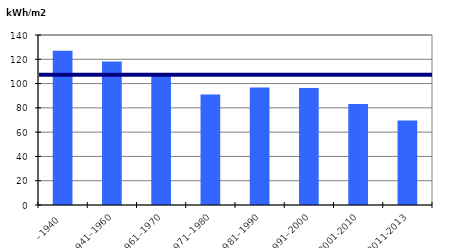
| Category | Byggårskategori |
|---|---|
| –1940 | 126.987 |
| 1941–1960 | 118.109 |
| 1961–1970 | 107.268 |
| 1971–1980 | 91.039 |
| 1981–1990 | 96.685 |
| 1991–2000 | 96.379 |
| 2001-2010 | 83.193 |
| 2011-2013 | 69.631 |